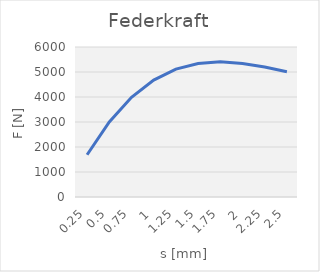
| Category | Series 0 |
|---|---|
| 0.25 | 1690.46 |
| 0.5 | 3005.263 |
| 0.75 | 3986.148 |
| 1.0 | 4674.854 |
| 1.25 | 5113.121 |
| 1.5 | 5342.69 |
| 1.75 | 5405.3 |
| 2.0 | 5342.69 |
| 2.25 | 5196.601 |
| 2.5 | 5008.772 |